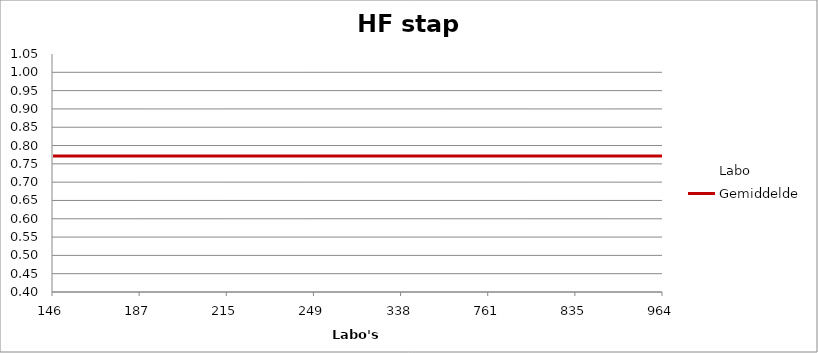
| Category | Labo | Gemiddelde |
|---|---|---|
| 146.0 | 0.43 | 0.772 |
| 187.0 | 0.807 | 0.772 |
| 215.0 | 1.014 | 0.772 |
| 249.0 | 0.754 | 0.772 |
| 338.0 | 0.615 | 0.772 |
| 761.0 | 0.822 | 0.772 |
| 835.0 | 0.782 | 0.772 |
| 964.0 | 0.867 | 0.772 |